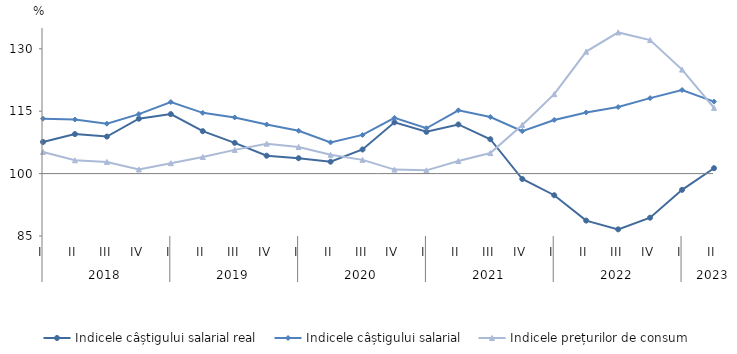
| Category | Indicele câștigului salarial real | Indicele câștigului salarial | Indicele prețurilor de consum |
|---|---|---|---|
| 0 | 107.6 | 113.2 | 105.2 |
| 1 | 109.5 | 113 | 103.2 |
| 2 | 108.9 | 112 | 102.8 |
| 3 | 113.2 | 114.3 | 101 |
| 4 | 114.3 | 117.2 | 102.5 |
| 5 | 110.2 | 114.6 | 104 |
| 6 | 107.4 | 113.5 | 105.7 |
| 7 | 104.3 | 111.8 | 107.2 |
| 8 | 103.7 | 110.3 | 106.4 |
| 9 | 102.861 | 107.5 | 104.51 |
| 10 | 105.8 | 109.3 | 103.3 |
| 11 | 112.322 | 113.4 | 100.96 |
| 12 | 110.042 | 110.9 | 100.78 |
| 13 | 111.816 | 115.2 | 103.026 |
| 14 | 108.263 | 113.6 | 104.93 |
| 15 | 98.7 | 110.2 | 111.7 |
| 16 | 94.8 | 112.9 | 119.1 |
| 17 | 88.7 | 114.7 | 129.32 |
| 18 | 86.6 | 116 | 133.938 |
| 19 | 89.4 | 118.136 | 132.1 |
| 20 | 96.1 | 120.1 | 125 |
| 21 | 101.3 | 117.3 | 115.8 |